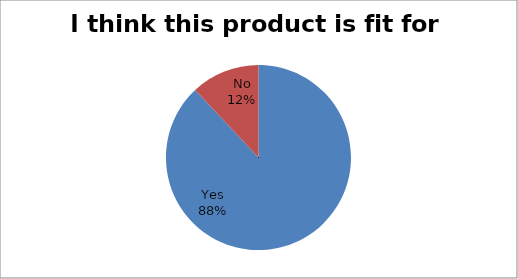
| Category | Series 0 |
|---|---|
| Yes | 22 |
| No | 3 |